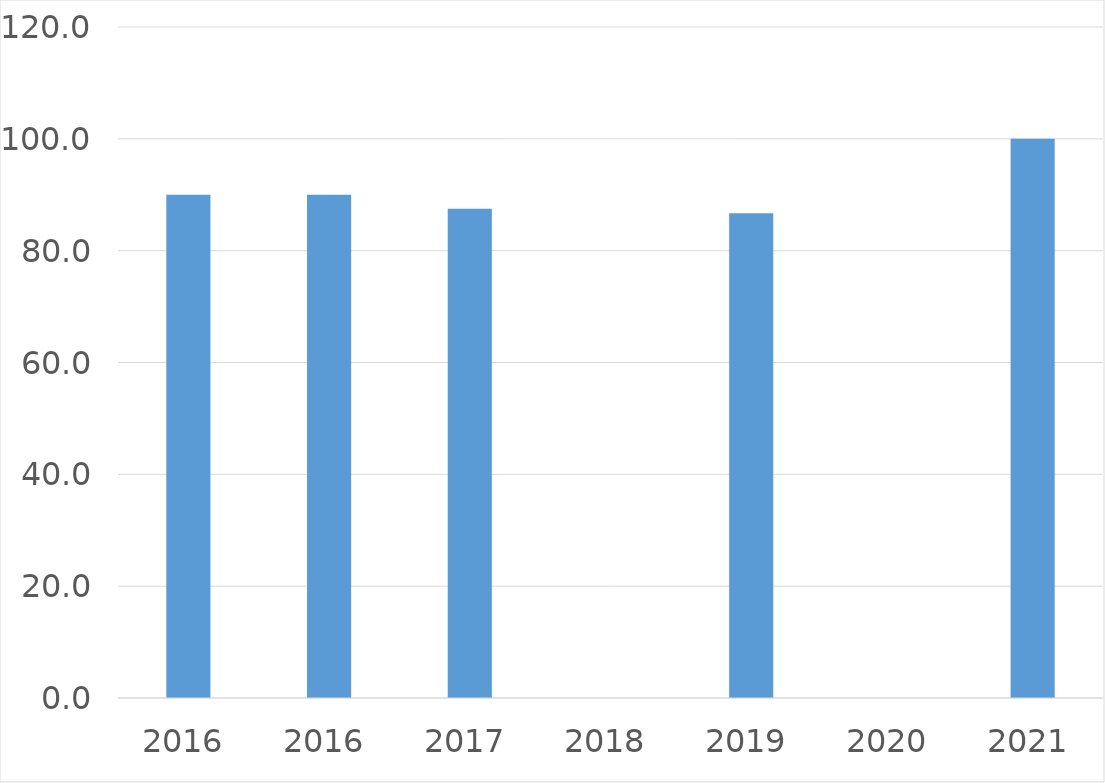
| Category | Series 0 |
|---|---|
| 2016 | 90 |
| 2016 | 90 |
| 2017 | 87.5 |
| 2018 | 0 |
| 2019 | 86.7 |
| 2020 | 0 |
| 2021 | 100 |